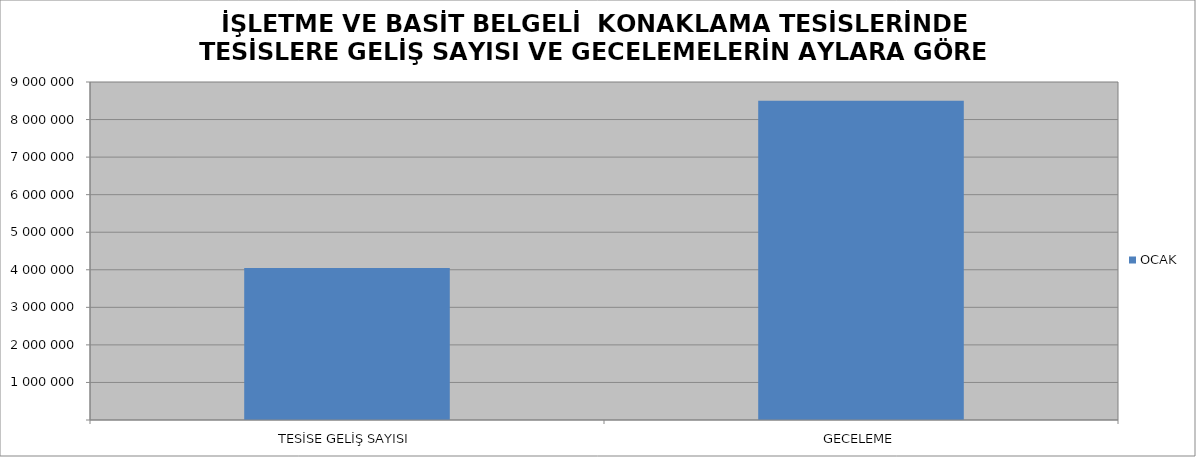
| Category | OCAK |
|---|---|
| TESİSE GELİŞ SAYISI | 4047187 |
| GECELEME | 8502645 |